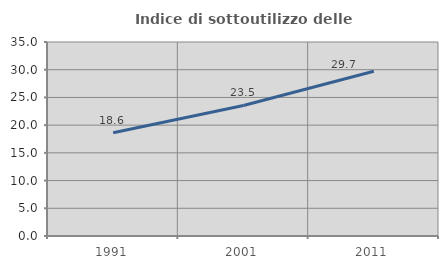
| Category | Indice di sottoutilizzo delle abitazioni  |
|---|---|
| 1991.0 | 18.626 |
| 2001.0 | 23.547 |
| 2011.0 | 29.724 |